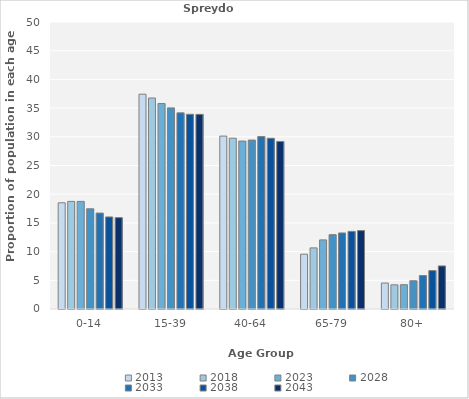
| Category | 2013 | 2018 | 2023 | 2028 | 2033 | 2038 | 2043 |
|---|---|---|---|---|---|---|---|
| 0-14 | 18.506 | 18.745 | 18.745 | 17.462 | 16.716 | 16.043 | 15.915 |
| 15-39 | 37.427 | 36.761 | 35.804 | 35.038 | 34.17 | 33.921 | 33.908 |
| 40-64 | 30.124 | 29.757 | 29.255 | 29.432 | 30.037 | 29.748 | 29.19 |
| 65-79 | 9.544 | 10.648 | 12.039 | 12.955 | 13.247 | 13.525 | 13.662 |
| 80+ | 4.523 | 4.211 | 4.235 | 4.924 | 5.83 | 6.691 | 7.5 |